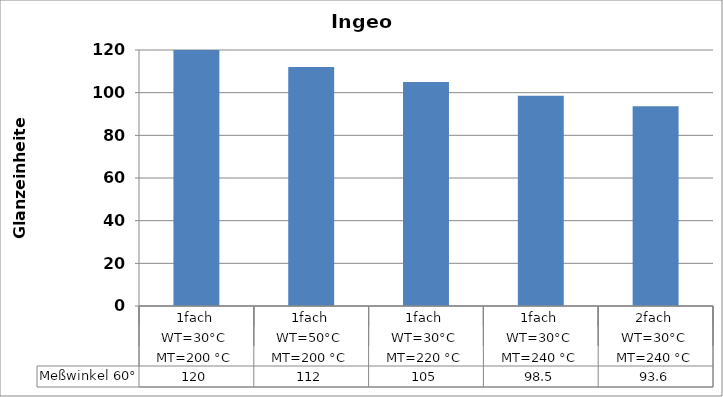
| Category | Meßwinkel 60° |
|---|---|
| 0 | 120 |
| 1 | 112 |
| 2 | 105 |
| 3 | 98.5 |
| 4 | 93.6 |